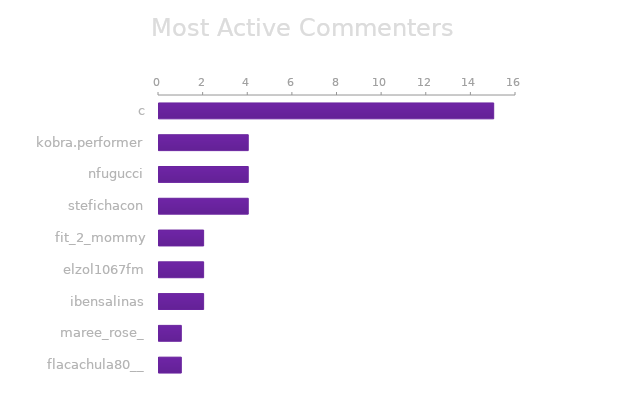
| Category | Series 0 |
|---|---|
| 0 | 15 |
| kobra.performer | 4 |
| nfugucci | 4 |
| stefichacon | 4 |
| fit_2_mommy | 2 |
| elzol1067fm | 2 |
| ibensalinas | 2 |
| maree_rose_ | 1 |
| flacachula80__ | 1 |
| jazmin.nin | 1 |